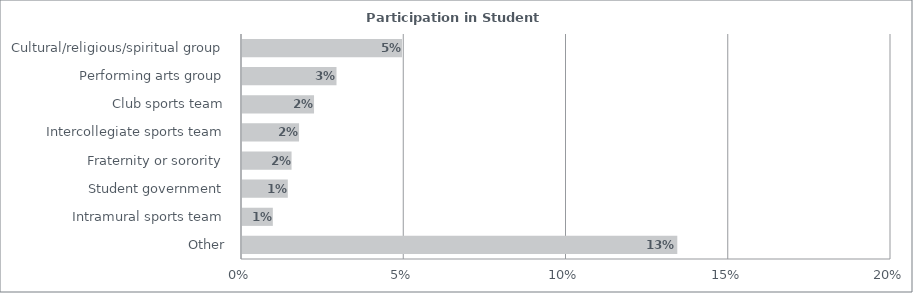
| Category | Series 0 |
|---|---|
| Other | 0.134 |
| Intramural sports team | 0.01 |
| Student government | 0.014 |
| Fraternity or sorority | 0.016 |
| Intercollegiate sports team | 0.018 |
| Club sports team | 0.023 |
| Performing arts group | 0.029 |
| Cultural/religious/spiritual group | 0.05 |